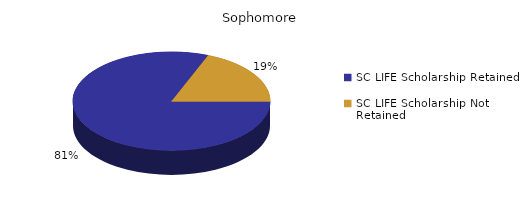
| Category | Sophomore |
|---|---|
| SC LIFE Scholarship Retained  | 1773 |
| SC LIFE Scholarship Not Retained  | 415 |